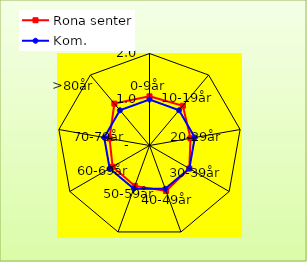
| Category | Rona senter | Kom. |
|---|---|---|
| 0-9år | 1.069 | 1 |
| 10-19år | 1.128 | 1 |
| 20-29år | 0.905 | 1 |
| 30-39år | 1 | 1 |
| 40-49år | 1.053 | 1 |
| 50-59år | 0.935 | 1 |
| 60-69år | 0.926 | 1 |
| 70-79år | 0.883 | 1 |
| >80år | 1.189 | 1 |